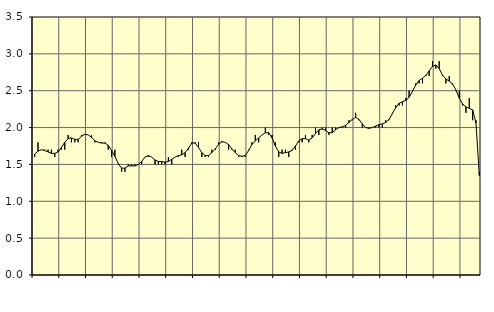
| Category | Piggar | Series 1 |
|---|---|---|
| nan | 1.6 | 1.64 |
| 87.0 | 1.8 | 1.68 |
| 87.0 | 1.7 | 1.7 |
| 87.0 | 1.7 | 1.69 |
| nan | 1.7 | 1.67 |
| 88.0 | 1.7 | 1.65 |
| 88.0 | 1.6 | 1.65 |
| 88.0 | 1.7 | 1.67 |
| nan | 1.7 | 1.73 |
| 89.0 | 1.7 | 1.8 |
| 89.0 | 1.9 | 1.85 |
| 89.0 | 1.8 | 1.86 |
| nan | 1.8 | 1.84 |
| 90.0 | 1.8 | 1.84 |
| 90.0 | 1.9 | 1.88 |
| 90.0 | 1.9 | 1.91 |
| nan | 1.9 | 1.9 |
| 91.0 | 1.9 | 1.87 |
| 91.0 | 1.8 | 1.82 |
| 91.0 | 1.8 | 1.8 |
| nan | 1.8 | 1.79 |
| 92.0 | 1.8 | 1.79 |
| 92.0 | 1.7 | 1.76 |
| 92.0 | 1.6 | 1.69 |
| nan | 1.7 | 1.61 |
| 93.0 | 1.5 | 1.51 |
| 93.0 | 1.4 | 1.45 |
| 93.0 | 1.4 | 1.45 |
| nan | 1.5 | 1.48 |
| 94.0 | 1.5 | 1.48 |
| 94.0 | 1.5 | 1.48 |
| 94.0 | 1.5 | 1.5 |
| nan | 1.5 | 1.54 |
| 95.0 | 1.6 | 1.6 |
| 95.0 | 1.6 | 1.62 |
| 95.0 | 1.6 | 1.6 |
| nan | 1.5 | 1.56 |
| 96.0 | 1.5 | 1.54 |
| 96.0 | 1.5 | 1.54 |
| 96.0 | 1.5 | 1.53 |
| nan | 1.6 | 1.54 |
| 97.0 | 1.5 | 1.57 |
| 97.0 | 1.6 | 1.6 |
| 97.0 | 1.6 | 1.62 |
| nan | 1.7 | 1.63 |
| 98.0 | 1.6 | 1.66 |
| 98.0 | 1.7 | 1.72 |
| 98.0 | 1.8 | 1.79 |
| nan | 1.8 | 1.79 |
| 99.0 | 1.8 | 1.73 |
| 99.0 | 1.6 | 1.66 |
| 99.0 | 1.6 | 1.62 |
| nan | 1.6 | 1.62 |
| 0.0 | 1.7 | 1.66 |
| 0.0 | 1.7 | 1.71 |
| 0.0 | 1.8 | 1.77 |
| nan | 1.8 | 1.81 |
| 1.0 | 1.8 | 1.8 |
| 1.0 | 1.7 | 1.77 |
| 1.0 | 1.7 | 1.71 |
| nan | 1.7 | 1.66 |
| 2.0 | 1.6 | 1.62 |
| 2.0 | 1.6 | 1.61 |
| 2.0 | 1.6 | 1.62 |
| nan | 1.7 | 1.69 |
| 3.0 | 1.8 | 1.77 |
| 3.0 | 1.9 | 1.82 |
| 3.0 | 1.8 | 1.86 |
| nan | 1.9 | 1.9 |
| 4.0 | 2 | 1.93 |
| 4.0 | 1.9 | 1.93 |
| 4.0 | 1.9 | 1.86 |
| nan | 1.8 | 1.75 |
| 5.0 | 1.6 | 1.67 |
| 5.0 | 1.7 | 1.65 |
| 5.0 | 1.7 | 1.66 |
| nan | 1.6 | 1.67 |
| 6.0 | 1.7 | 1.69 |
| 6.0 | 1.7 | 1.75 |
| 6.0 | 1.8 | 1.82 |
| nan | 1.8 | 1.85 |
| 7.0 | 1.9 | 1.85 |
| 7.0 | 1.8 | 1.83 |
| 7.0 | 1.9 | 1.86 |
| nan | 2 | 1.92 |
| 8.0 | 1.9 | 1.97 |
| 8.0 | 2 | 1.98 |
| 8.0 | 2 | 1.96 |
| nan | 1.9 | 1.93 |
| 9.0 | 2 | 1.93 |
| 9.0 | 2 | 1.97 |
| 9.0 | 2 | 2 |
| nan | 2 | 2.01 |
| 10.0 | 2 | 2.03 |
| 10.0 | 2.1 | 2.07 |
| 10.0 | 2.1 | 2.11 |
| nan | 2.2 | 2.14 |
| 11.0 | 2.1 | 2.11 |
| 11.0 | 2 | 2.05 |
| 11.0 | 2 | 2 |
| nan | 2 | 1.99 |
| 12.0 | 2 | 2 |
| 12.0 | 2 | 2.02 |
| 12.0 | 2 | 2.04 |
| nan | 2 | 2.05 |
| 13.0 | 2.1 | 2.07 |
| 13.0 | 2.1 | 2.11 |
| 13.0 | 2.2 | 2.19 |
| nan | 2.3 | 2.27 |
| 14.0 | 2.3 | 2.33 |
| 14.0 | 2.3 | 2.35 |
| 14.0 | 2.4 | 2.37 |
| nan | 2.5 | 2.41 |
| 15.0 | 2.5 | 2.49 |
| 15.0 | 2.6 | 2.58 |
| 15.0 | 2.6 | 2.64 |
| nan | 2.6 | 2.67 |
| 16.0 | 2.7 | 2.71 |
| 16.0 | 2.7 | 2.77 |
| 16.0 | 2.9 | 2.83 |
| nan | 2.8 | 2.85 |
| 17.0 | 2.9 | 2.8 |
| 17.0 | 2.7 | 2.71 |
| 17.0 | 2.6 | 2.66 |
| nan | 2.7 | 2.63 |
| 18.0 | 2.6 | 2.59 |
| 18.0 | 2.5 | 2.51 |
| 18.0 | 2.5 | 2.4 |
| nan | 2.3 | 2.32 |
| 19.0 | 2.2 | 2.28 |
| 19.0 | 2.4 | 2.26 |
| 19.0 | 2.1 | 2.24 |
| nan | 2.1 | 2.06 |
| 20.0 | 1.4 | 1.35 |